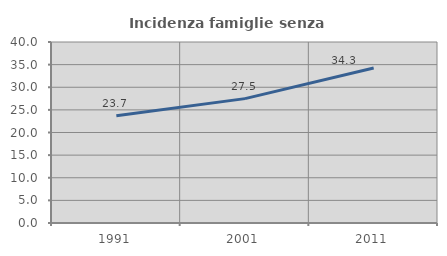
| Category | Incidenza famiglie senza nuclei |
|---|---|
| 1991.0 | 23.692 |
| 2001.0 | 27.487 |
| 2011.0 | 34.264 |